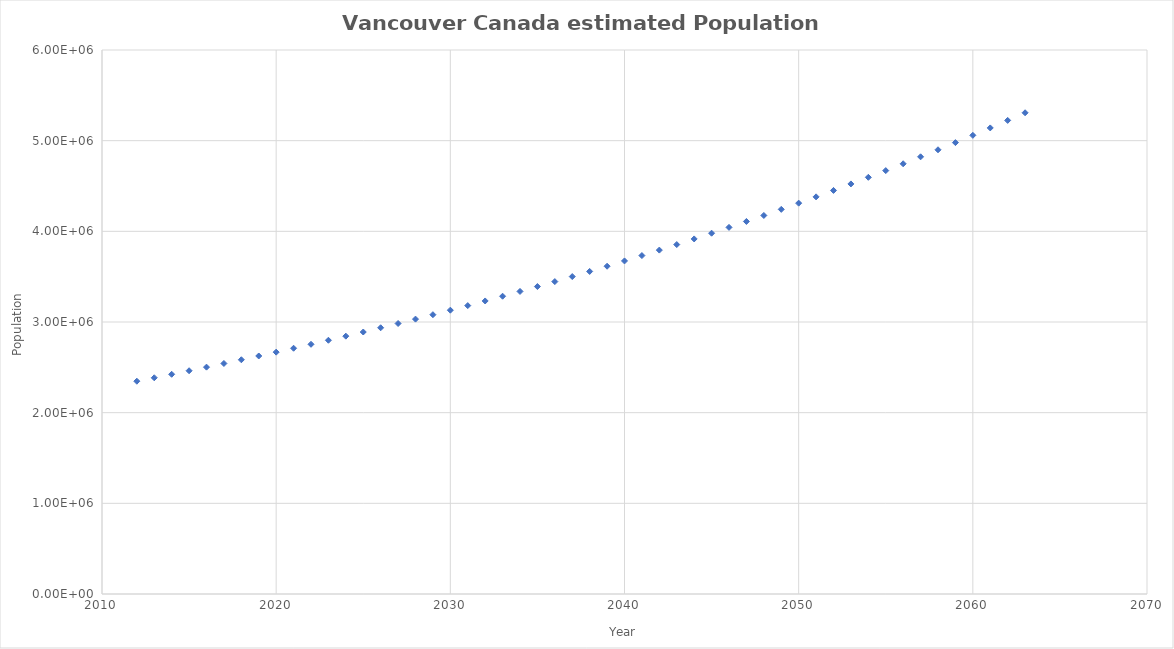
| Category | Series 0 |
|---|---|
| 2012.0 | 2347000 |
| 2013.0 | 2384854.025 |
| 2014.0 | 2423318.585 |
| 2015.0 | 2462403.528 |
| 2016.0 | 2502118.86 |
| 2017.0 | 2542474.748 |
| 2018.0 | 2583481.523 |
| 2019.0 | 2625149.684 |
| 2020.0 | 2667489.897 |
| 2021.0 | 2710513.003 |
| 2022.0 | 2754230.014 |
| 2023.0 | 2798652.124 |
| 2024.0 | 2843790.703 |
| 2025.0 | 2889657.309 |
| 2026.0 | 2936263.683 |
| 2027.0 | 2983621.756 |
| 2028.0 | 3031743.652 |
| 2029.0 | 3080641.692 |
| 2030.0 | 3130328.393 |
| 2031.0 | 3180816.475 |
| 2032.0 | 3232118.863 |
| 2033.0 | 3284248.691 |
| 2034.0 | 3337219.305 |
| 2035.0 | 3391044.265 |
| 2036.0 | 3445737.352 |
| 2037.0 | 3501312.565 |
| 2038.0 | 3557784.134 |
| 2039.0 | 3615166.515 |
| 2040.0 | 3673474.399 |
| 2041.0 | 3732722.712 |
| 2042.0 | 3792926.622 |
| 2043.0 | 3854101.542 |
| 2044.0 | 3916263.133 |
| 2045.0 | 3979427.31 |
| 2046.0 | 4043610.241 |
| 2047.0 | 4108828.358 |
| 2048.0 | 4175098.358 |
| 2049.0 | 4242437.206 |
| 2050.0 | 4310862.141 |
| 2051.0 | 4380390.68 |
| 2052.0 | 4451040.624 |
| 2053.0 | 4522830.058 |
| 2054.0 | 4595777.361 |
| 2055.0 | 4669901.208 |
| 2056.0 | 4745220.576 |
| 2057.0 | 4821754.745 |
| 2058.0 | 4899523.311 |
| 2059.0 | 4978546.181 |
| 2060.0 | 5058843.586 |
| 2061.0 | 5140436.083 |
| 2062.0 | 5223344.559 |
| 2063.0 | 5307590.24 |